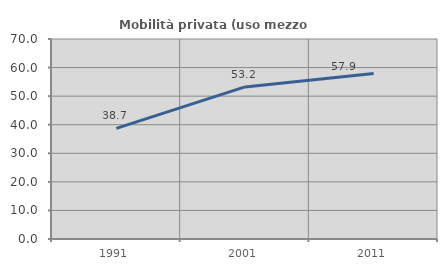
| Category | Mobilità privata (uso mezzo privato) |
|---|---|
| 1991.0 | 38.732 |
| 2001.0 | 53.231 |
| 2011.0 | 57.931 |